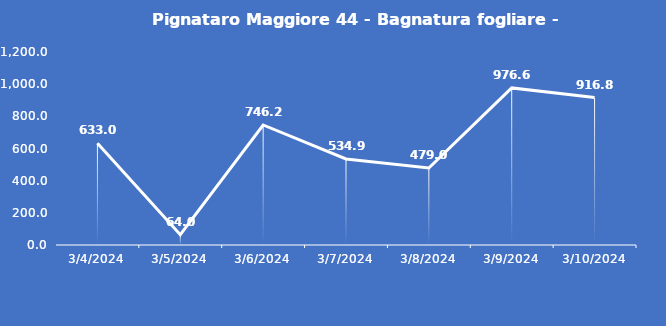
| Category | Pignataro Maggiore 44 - Bagnatura fogliare - Grezzo (min) |
|---|---|
| 3/4/24 | 633 |
| 3/5/24 | 64 |
| 3/6/24 | 746.2 |
| 3/7/24 | 534.9 |
| 3/8/24 | 479 |
| 3/9/24 | 976.6 |
| 3/10/24 | 916.8 |